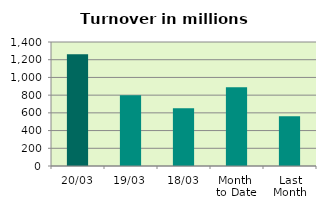
| Category | Series 0 |
|---|---|
| 20/03 | 1260.528 |
| 19/03 | 798.286 |
| 18/03 | 651.158 |
| Month 
to Date | 889.112 |
| Last
Month | 561.452 |